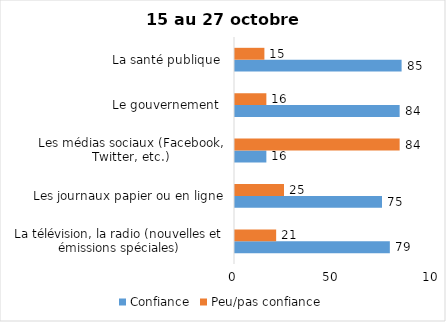
| Category | Confiance | Peu/pas confiance |
|---|---|---|
| La télévision, la radio (nouvelles et émissions spéciales) | 79 | 21 |
| Les journaux papier ou en ligne | 75 | 25 |
| Les médias sociaux (Facebook, Twitter, etc.) | 16 | 84 |
| Le gouvernement  | 84 | 16 |
| La santé publique  | 85 | 15 |